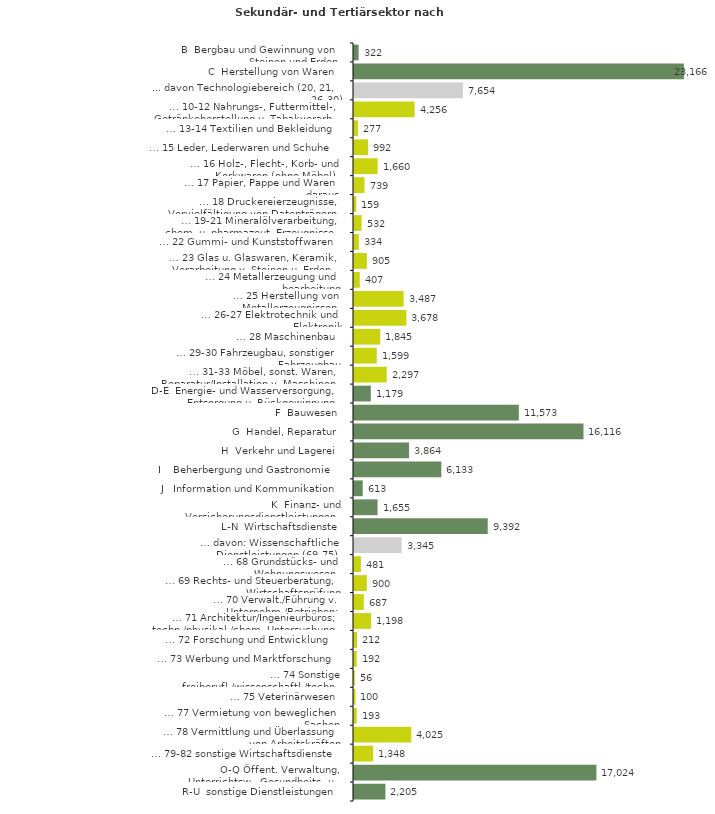
| Category | Series 0 |
|---|---|
| B  Bergbau und Gewinnung von Steinen und Erden | 322 |
| C  Herstellung von Waren | 23166 |
| ... davon Technologiebereich (20, 21, 26-30) | 7654 |
| … 10-12 Nahrungs-, Futtermittel-, Getränkeherstellung u. Tabakverarb. | 4256 |
| … 13-14 Textilien und Bekleidung | 277 |
| … 15 Leder, Lederwaren und Schuhe | 992 |
| … 16 Holz-, Flecht-, Korb- und Korkwaren (ohne Möbel)  | 1660 |
| … 17 Papier, Pappe und Waren daraus  | 739 |
| … 18 Druckereierzeugnisse, Vervielfältigung von Datenträgern | 159 |
| … 19-21 Mineralölverarbeitung, chem. u. pharmazeut. Erzeugnisse | 532 |
| … 22 Gummi- und Kunststoffwaren | 334 |
| … 23 Glas u. Glaswaren, Keramik, Verarbeitung v. Steinen u. Erden  | 905 |
| … 24 Metallerzeugung und -bearbeitung | 407 |
| … 25 Herstellung von Metallerzeugnissen  | 3487 |
| … 26-27 Elektrotechnik und Elektronik | 3678 |
| … 28 Maschinenbau | 1845 |
| … 29-30 Fahrzeugbau, sonstiger Fahrzeugbau | 1599 |
| … 31-33 Möbel, sonst. Waren, Reparatur/Installation v. Maschinen | 2297 |
| D-E  Energie- und Wasserversorgung, Entsorgung u. Rückgewinnung | 1179 |
| F  Bauwesen | 11573 |
| G  Handel, Reparatur | 16116 |
| H  Verkehr und Lagerei | 3864 |
| I    Beherbergung und Gastronomie | 6133 |
| J   Information und Kommunikation | 613 |
| K  Finanz- und Versicherungsdienstleistungen | 1655 |
| L-N  Wirtschaftsdienste | 9392 |
| … davon: Wissenschaftliche Dienstleistungen (69-75) | 3345 |
| … 68 Grundstücks- und Wohnungswesen  | 481 |
| … 69 Rechts- und Steuerberatung, Wirtschaftsprüfung | 900 |
| … 70 Verwalt./Führung v. Unternehm./Betrieben; Unternehmensberat. | 687 |
| … 71 Architektur/Ingenieurbüros; techn./physikal./chem. Untersuchung | 1198 |
| … 72 Forschung und Entwicklung  | 212 |
| … 73 Werbung und Marktforschung | 192 |
| … 74 Sonstige freiberufl./wissenschaftl./techn. Tätigkeiten | 56 |
| … 75 Veterinärwesen | 100 |
| … 77 Vermietung von beweglichen Sachen  | 193 |
| … 78 Vermittlung und Überlassung von Arbeitskräften | 4025 |
| … 79-82 sonstige Wirtschaftsdienste | 1348 |
| O-Q Öffent. Verwaltung, Unterrichtsw., Gesundheits- u. Sozialwesen | 17024 |
| R-U  sonstige Dienstleistungen | 2205 |